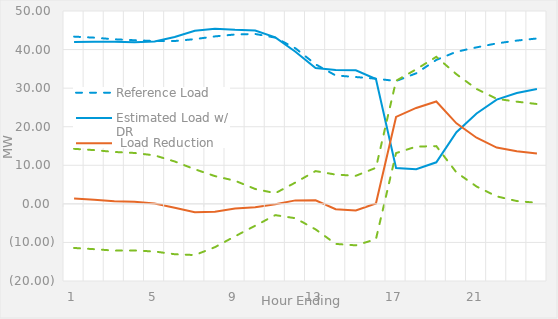
| Category | Reference Load | Estimated Load w/ DR |  Load Reduction | 90% Confidence Band | Series 4 |
|---|---|---|---|---|---|
| 1.0 | 43.359 | 41.943 | 1.416 | -11.433 | 14.265 |
| 2.0 | 43.09 | 41.997 | 1.093 | -11.748 | 13.933 |
| 3.0 | 42.669 | 42.003 | 0.667 | -12.122 | 13.455 |
| 4.0 | 42.421 | 41.871 | 0.551 | -12.094 | 13.196 |
| 5.0 | 42.219 | 42.109 | 0.11 | -12.349 | 12.569 |
| 6.0 | 42.219 | 43.253 | -1.034 | -13.057 | 10.989 |
| 7.0 | 42.705 | 44.86 | -2.155 | -13.278 | 8.968 |
| 8.0 | 43.412 | 45.429 | -2.017 | -11.228 | 7.194 |
| 9.0 | 43.915 | 45.12 | -1.205 | -8.404 | 5.993 |
| 10.0 | 44.042 | 44.948 | -0.905 | -5.668 | 3.857 |
| 11.0 | 43.094 | 43.172 | -0.078 | -2.924 | 2.768 |
| 12.0 | 40.329 | 39.427 | 0.902 | -3.726 | 5.529 |
| 13.0 | 36.18 | 35.237 | 0.943 | -6.61 | 8.496 |
| 14.0 | 33.282 | 34.68 | -1.399 | -10.385 | 7.588 |
| 15.0 | 32.88 | 34.618 | -1.738 | -10.757 | 7.281 |
| 16.0 | 32.455 | 32.369 | 0.086 | -9.172 | 9.343 |
| 17.0 | 31.844 | 9.308 | 22.536 | 13.163 | 31.909 |
| 18.0 | 33.848 | 8.985 | 24.862 | 14.842 | 34.883 |
| 19.0 | 37.316 | 10.772 | 26.545 | 14.968 | 38.122 |
| 20.0 | 39.439 | 18.561 | 20.878 | 8.148 | 33.607 |
| 21.0 | 40.573 | 23.43 | 17.143 | 4.497 | 29.789 |
| 22.0 | 41.601 | 27.012 | 14.588 | 1.941 | 27.235 |
| 23.0 | 42.329 | 28.718 | 13.611 | 0.728 | 26.494 |
| 24.0 | 42.875 | 29.801 | 13.074 | 0.265 | 25.884 |